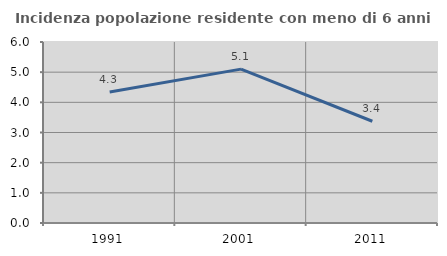
| Category | Incidenza popolazione residente con meno di 6 anni |
|---|---|
| 1991.0 | 4.345 |
| 2001.0 | 5.101 |
| 2011.0 | 3.373 |